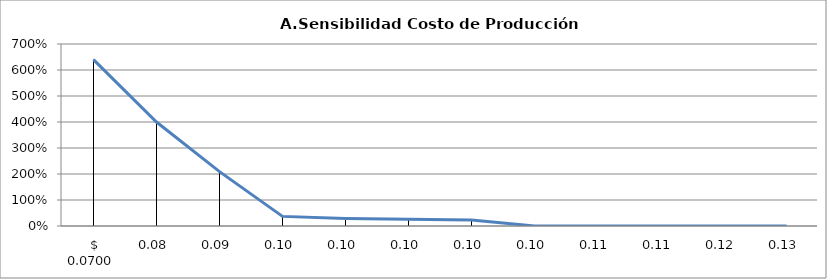
| Category | Series 0 |
|---|---|
| 0.07 | 6.4 |
| 0.08 | 4 |
| 0.09 | 2.09 |
| 0.0995 | 0.37 |
| 0.0998 | 0.29 |
| 0.0999 | 0.26 |
| 0.1 | 0.23 |
| 0.101 | 0 |
| 0.105 | 0 |
| 0.11 | 0 |
| 0.12 | 0 |
| 0.13 | 0 |